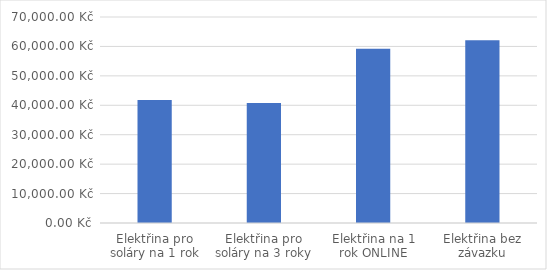
| Category | Series 0 |
|---|---|
| Elektřina pro soláry na 1 rok | 41831.55 |
| Elektřina pro soláry na 3 roky | 40742.55 |
| Elektřina na 1 rok ONLINE | 59195 |
| Elektřina bez závazku | 62103.84 |